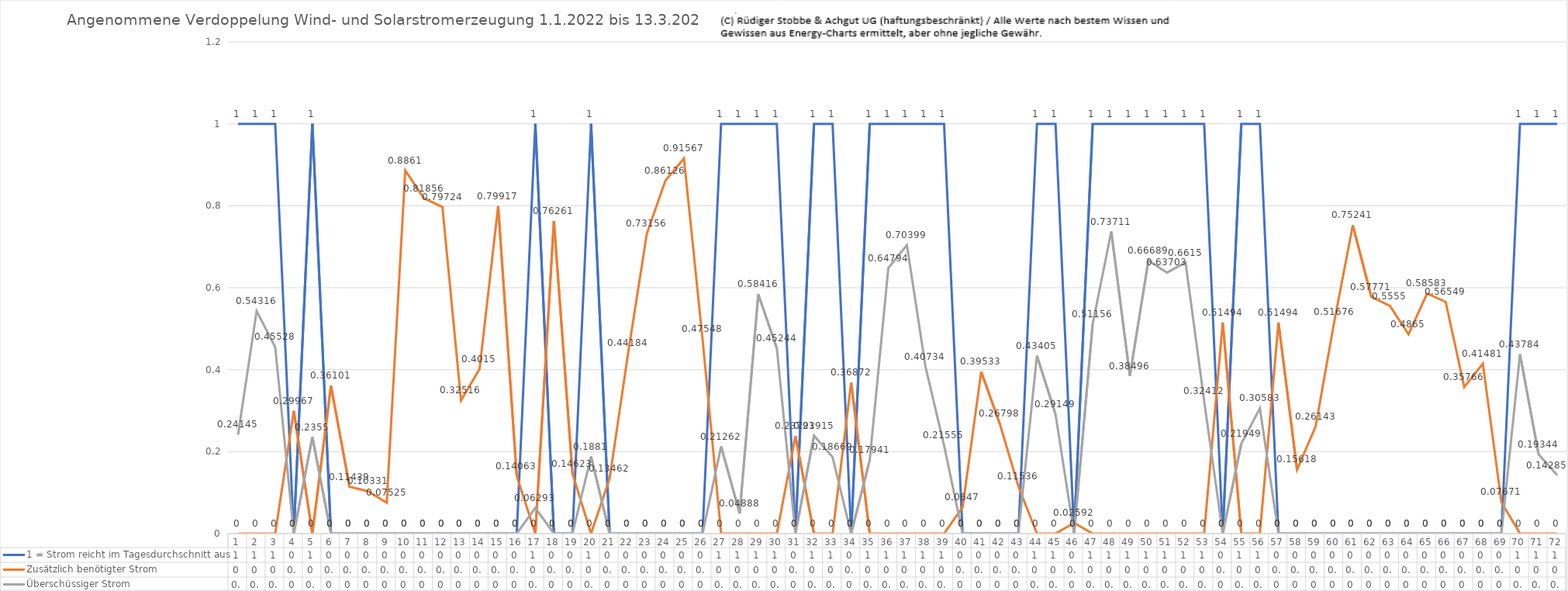
| Category | 1 = Strom reicht im Tagesdurchschnitt aus | Zusätzlich benötigter Strom | Überschüssiger Strom |
|---|---|---|---|
| 0 | 1 | 0 | 0.241 |
| 1 | 1 | 0 | 0.543 |
| 2 | 1 | 0 | 0.455 |
| 3 | 0 | 0.3 | 0 |
| 4 | 1 | 0 | 0.236 |
| 5 | 0 | 0.361 | 0 |
| 6 | 0 | 0.114 | 0 |
| 7 | 0 | 0.103 | 0 |
| 8 | 0 | 0.075 | 0 |
| 9 | 0 | 0.886 | 0 |
| 10 | 0 | 0.819 | 0 |
| 11 | 0 | 0.797 | 0 |
| 12 | 0 | 0.325 | 0 |
| 13 | 0 | 0.402 | 0 |
| 14 | 0 | 0.799 | 0 |
| 15 | 0 | 0.141 | 0 |
| 16 | 1 | 0 | 0.063 |
| 17 | 0 | 0.763 | 0 |
| 18 | 0 | 0.146 | 0 |
| 19 | 1 | 0 | 0.188 |
| 20 | 0 | 0.135 | 0 |
| 21 | 0 | 0.442 | 0 |
| 22 | 0 | 0.732 | 0 |
| 23 | 0 | 0.861 | 0 |
| 24 | 0 | 0.916 | 0 |
| 25 | 0 | 0.475 | 0 |
| 26 | 1 | 0 | 0.213 |
| 27 | 1 | 0 | 0.049 |
| 28 | 1 | 0 | 0.584 |
| 29 | 1 | 0 | 0.452 |
| 30 | 0 | 0.238 | 0 |
| 31 | 1 | 0 | 0.239 |
| 32 | 1 | 0 | 0.187 |
| 33 | 0 | 0.369 | 0 |
| 34 | 1 | 0 | 0.179 |
| 35 | 1 | 0 | 0.648 |
| 36 | 1 | 0 | 0.704 |
| 37 | 1 | 0 | 0.407 |
| 38 | 1 | 0 | 0.216 |
| 39 | 0 | 0.065 | 0 |
| 40 | 0 | 0.395 | 0 |
| 41 | 0 | 0.268 | 0 |
| 42 | 0 | 0.115 | 0 |
| 43 | 1 | 0 | 0.434 |
| 44 | 1 | 0 | 0.291 |
| 45 | 0 | 0.026 | 0 |
| 46 | 1 | 0 | 0.512 |
| 47 | 1 | 0 | 0.737 |
| 48 | 1 | 0 | 0.385 |
| 49 | 1 | 0 | 0.667 |
| 50 | 1 | 0 | 0.637 |
| 51 | 1 | 0 | 0.661 |
| 52 | 1 | 0 | 0.324 |
| 53 | 0 | 0.515 | 0 |
| 54 | 1 | 0 | 0.219 |
| 55 | 1 | 0 | 0.306 |
| 56 | 0 | 0.515 | 0 |
| 57 | 0 | 0.156 | 0 |
| 58 | 0 | 0.261 | 0 |
| 59 | 0 | 0.517 | 0 |
| 60 | 0 | 0.752 | 0 |
| 61 | 0 | 0.578 | 0 |
| 62 | 0 | 0.556 | 0 |
| 63 | 0 | 0.487 | 0 |
| 64 | 0 | 0.586 | 0 |
| 65 | 0 | 0.565 | 0 |
| 66 | 0 | 0.358 | 0 |
| 67 | 0 | 0.415 | 0 |
| 68 | 0 | 0.077 | 0 |
| 69 | 1 | 0 | 0.438 |
| 70 | 1 | 0 | 0.193 |
| 71 | 1 | 0 | 0.143 |